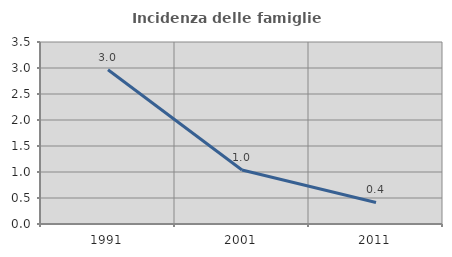
| Category | Incidenza delle famiglie numerose |
|---|---|
| 1991.0 | 2.966 |
| 2001.0 | 1.037 |
| 2011.0 | 0.414 |